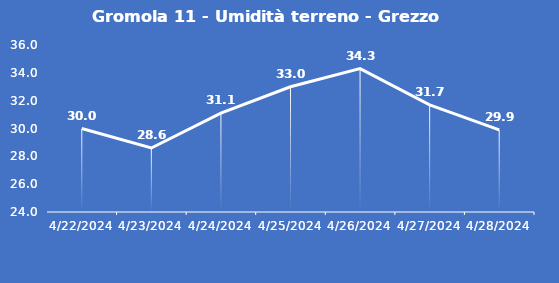
| Category | Gromola 11 - Umidità terreno - Grezzo (%VWC) |
|---|---|
| 4/22/24 | 30 |
| 4/23/24 | 28.6 |
| 4/24/24 | 31.1 |
| 4/25/24 | 33 |
| 4/26/24 | 34.3 |
| 4/27/24 | 31.7 |
| 4/28/24 | 29.9 |